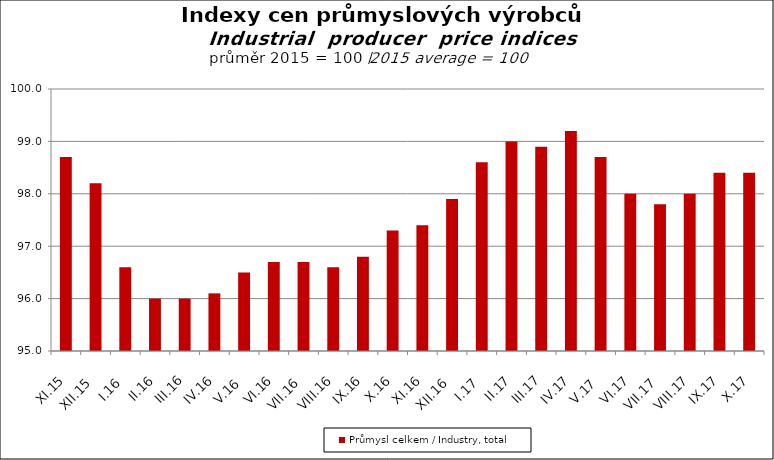
| Category | Průmysl celkem / Industry, total |
|---|---|
| XI.15 | 98.7 |
| XII.15 | 98.2 |
| I.16 | 96.6 |
| II.16 | 96 |
| III.16 | 96 |
| IV.16 | 96.1 |
| V.16 | 96.5 |
| VI.16 | 96.7 |
| VII.16 | 96.7 |
| VIII.16 | 96.6 |
| IX.16 | 96.8 |
| X.16 | 97.3 |
| XI.16 | 97.4 |
| XII.16 | 97.9 |
| I.17 | 98.6 |
| II.17 | 99 |
| III.17 | 98.9 |
| IV.17 | 99.2 |
| V.17 | 98.7 |
| VI.17 | 98 |
| VII.17 | 97.8 |
| VIII.17 | 98 |
| IX.17 | 98.4 |
| X.17 | 98.4 |